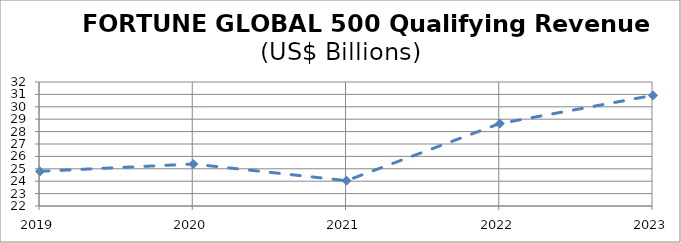
| Category | FORTUNE GLOBAL 500 QUALIFYING REVENUES |
|---|---|
| 2019.0 | 24.796 |
| 2020.0 | 25.386 |
| 2021.0 | 24.043 |
| 2022.0 | 28.649 |
| 2023.0 | 30.922 |